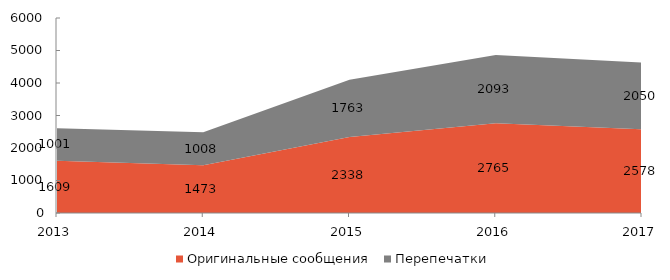
| Category | Оригинальные сообщения | Перепечатки |
|---|---|---|
| 2013 | 1609 | 1001 |
| 2014 | 1473 | 1008 |
| 2015 | 2338 | 1763 |
| 2016 | 2765 | 2093 |
| 2017 | 2578 | 2050 |